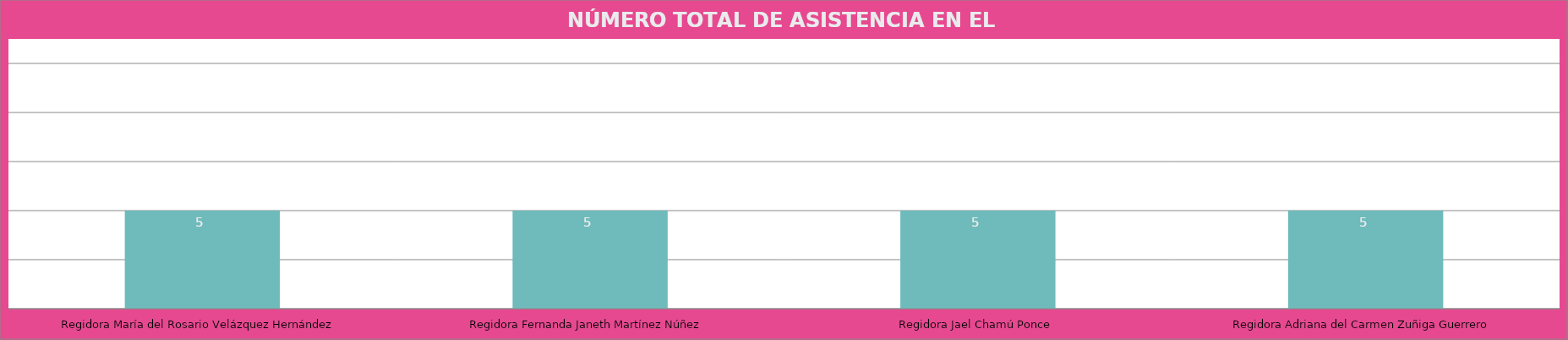
| Category | Regidora María del Rosario Velázquez Hernández |
|---|---|
| Regidora María del Rosario Velázquez Hernández | 5 |
| Regidora Fernanda Janeth Martínez Núñez | 5 |
| Regidora Jael Chamú Ponce | 5 |
| Regidora Adriana del Carmen Zuñiga Guerrero | 5 |